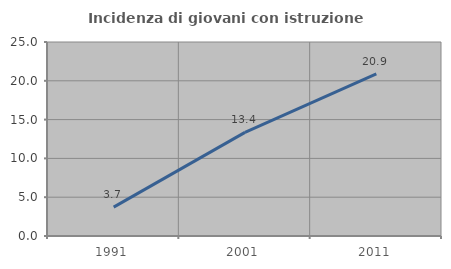
| Category | Incidenza di giovani con istruzione universitaria |
|---|---|
| 1991.0 | 3.72 |
| 2001.0 | 13.358 |
| 2011.0 | 20.898 |